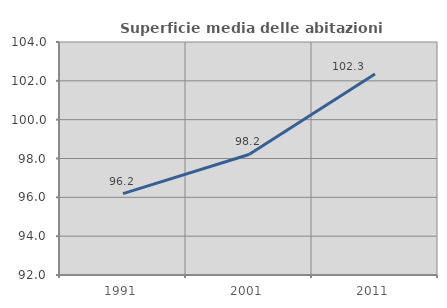
| Category | Superficie media delle abitazioni occupate |
|---|---|
| 1991.0 | 96.192 |
| 2001.0 | 98.208 |
| 2011.0 | 102.349 |